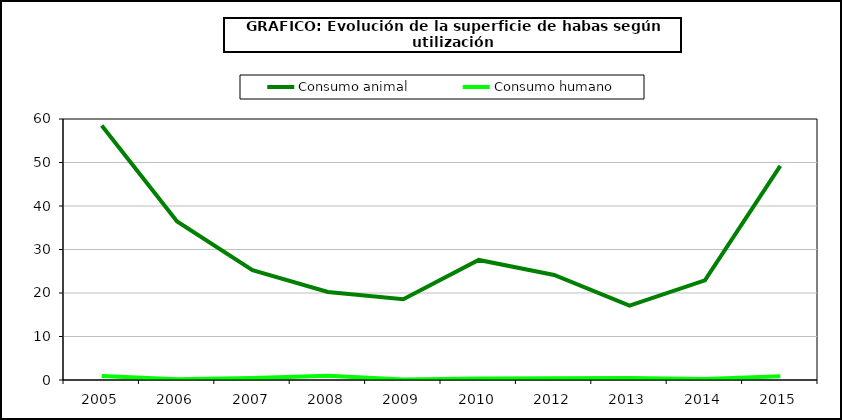
| Category | Consumo animal | Consumo humano |
|---|---|---|
| 2005 | 58.484 | 0.904 |
| 2006 | 36.441 | 0.162 |
| 2007 | 25.237 | 0.435 |
| 2008 | 20.238 | 0.969 |
| 2009 | 18.586 | 0.118 |
| 2010 | 27.596 | 0.361 |
| 2012 | 24.156 | 0.408 |
| 2013 | 17.1 | 0.442 |
| 2014 | 22.918 | 0.247 |
| 2015 | 49.204 | 0.868 |